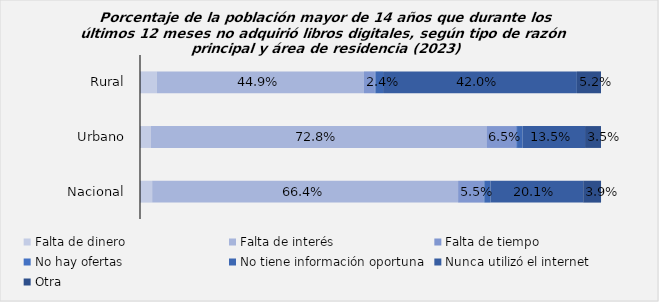
| Category | Falta de dinero | Falta de interés | Falta de tiempo | No hay ofertas | No tiene información oportuna | Nunca utilizó el internet | Otra |
|---|---|---|---|---|---|---|---|
| Rural | 0.037 | 0.449 | 0.024 | 0.002 | 0.016 | 0.42 | 0.052 |
| Urbano | 0.023 | 0.728 | 0.065 | 0.002 | 0.012 | 0.135 | 0.035 |
| Nacional | 0.026 | 0.664 | 0.055 | 0.002 | 0.013 | 0.201 | 0.039 |